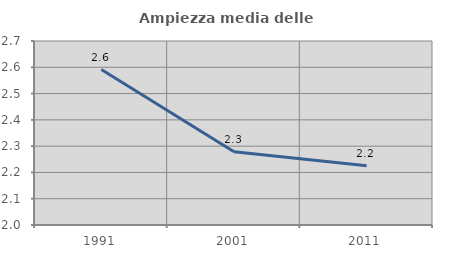
| Category | Ampiezza media delle famiglie |
|---|---|
| 1991.0 | 2.591 |
| 2001.0 | 2.279 |
| 2011.0 | 2.225 |